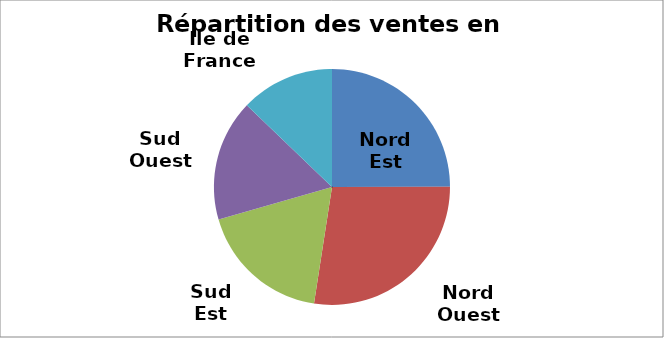
| Category | Series 0 |
|---|---|
| Nord Est | 25100 |
| Nord Ouest | 27600 |
| Sud Est | 18200 |
| Sud Ouest | 16700 |
| Ile de France | 12900 |